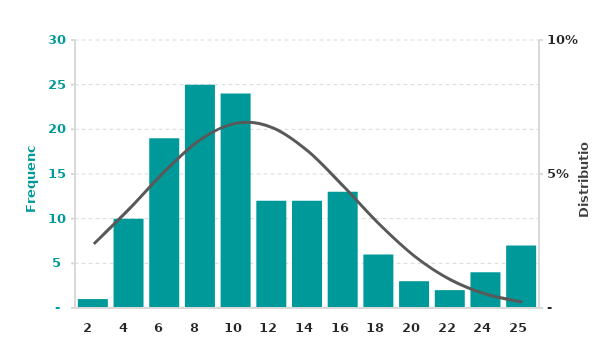
| Category | Colume data |
|---|---|
| 2.0 | 1 |
| 3.957890020745122 | 10 |
| 5.915780041490244 | 19 |
| 7.873670062235366 | 25 |
| 9.831560082980488 | 24 |
| 11.78945010372561 | 12 |
| 13.747340124470732 | 12 |
| 15.705230145215854 | 13 |
| 17.663120165960976 | 6 |
| 19.621010186706098 | 3 |
| 21.57890020745122 | 2 |
| 23.53679022819634 | 4 |
| 25.494680248941464 | 7 |